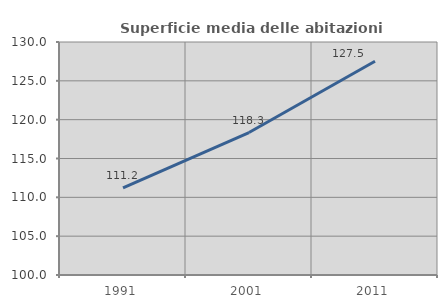
| Category | Superficie media delle abitazioni occupate |
|---|---|
| 1991.0 | 111.23 |
| 2001.0 | 118.344 |
| 2011.0 | 127.515 |